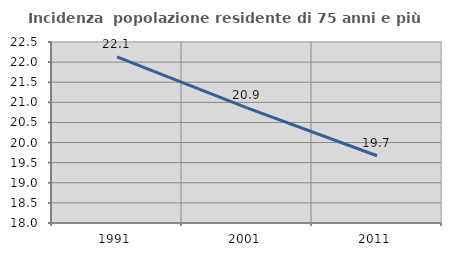
| Category | Incidenza  popolazione residente di 75 anni e più |
|---|---|
| 1991.0 | 22.131 |
| 2001.0 | 20.863 |
| 2011.0 | 19.672 |